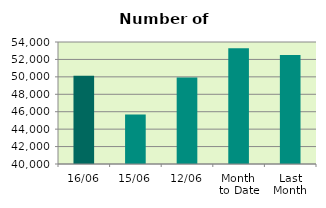
| Category | Series 0 |
|---|---|
| 16/06 | 50130 |
| 15/06 | 45690 |
| 12/06 | 49938 |
| Month 
to Date | 53292.167 |
| Last
Month | 52506.1 |